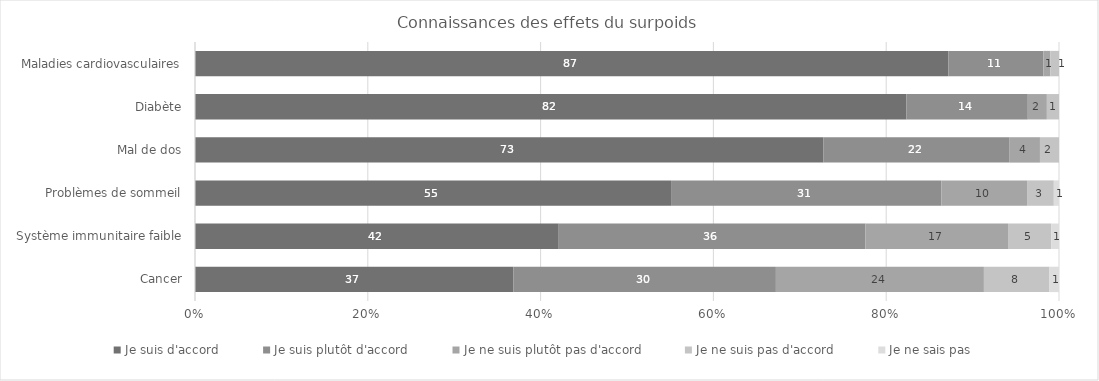
| Category | Je suis d'accord | Je suis plutôt d'accord | Je ne suis plutôt pas d'accord | Je ne suis pas d'accord | Je ne sais pas |
|---|---|---|---|---|---|
| Maladies cardiovasculaires | 87.1 | 11 | 0.8 | 1 | 0 |
| Diabète | 82.1 | 14 | 2.2 | 1.4 | 0 |
| Mal de dos | 72.6 | 21.5 | 3.5 | 2.2 | 0 |
| Problèmes de sommeil | 55.1 | 31.3 | 9.9 | 3.1 | 0.6 |
| Système immunitaire faible | 42.1 | 35.5 | 16.5 | 5 | 0.9 |
| Cancer | 36.9 | 30.4 | 24.1 | 7.6 | 1.1 |